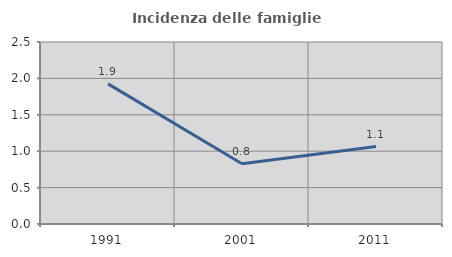
| Category | Incidenza delle famiglie numerose |
|---|---|
| 1991.0 | 1.925 |
| 2001.0 | 0.828 |
| 2011.0 | 1.064 |